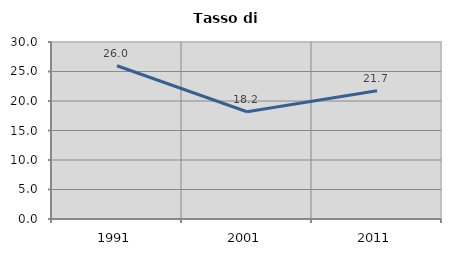
| Category | Tasso di disoccupazione   |
|---|---|
| 1991.0 | 25.979 |
| 2001.0 | 18.174 |
| 2011.0 | 21.744 |